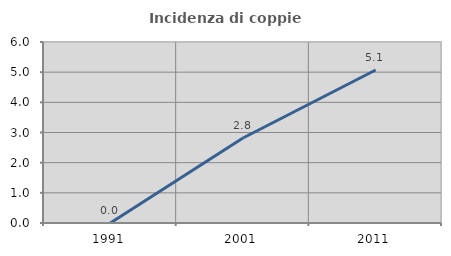
| Category | Incidenza di coppie miste |
|---|---|
| 1991.0 | 0 |
| 2001.0 | 2.817 |
| 2011.0 | 5.071 |